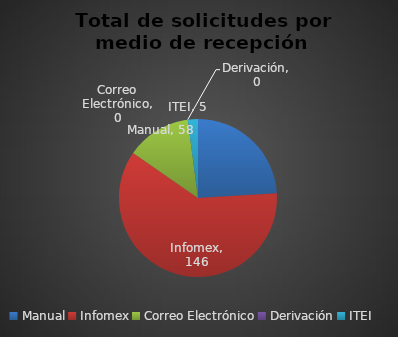
| Category | Series 0 |
|---|---|
| Manual | 58 |
| Infomex | 146 |
| Correo Electrónico | 32 |
| Derivación | 0 |
| ITEI | 5 |